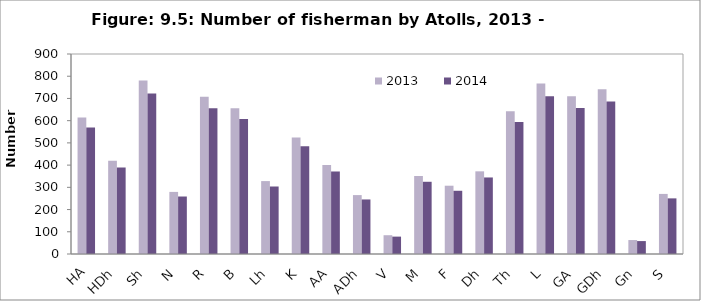
| Category | 2013  | 2014  |
|---|---|---|
| HA | 614.397 | 568.852 |
| HDh | 419.867 | 388.742 |
| Sh | 780.27 | 722.429 |
| N | 279.422 | 258.709 |
| R | 708.141 | 655.646 |
| B | 656.159 | 607.517 |
| Lh | 328.079 | 303.759 |
| K | 523.734 | 484.909 |
| AA | 401.04 | 371.311 |
| ADh | 265.094 | 245.443 |
| V | 84.502 | 78.237 |
| M | 351.014 | 324.993 |
| F | 307.296 | 284.516 |
| Dh | 371.993 | 344.417 |
| Th | 642.124 | 594.523 |
| L | 766.92 | 710.068 |
| GA | 709.363 | 656.778 |
| GDh | 741.589 | 686.615 |
| Gn | 62.789 | 58.135 |
| S | 270.376 | 250.333 |